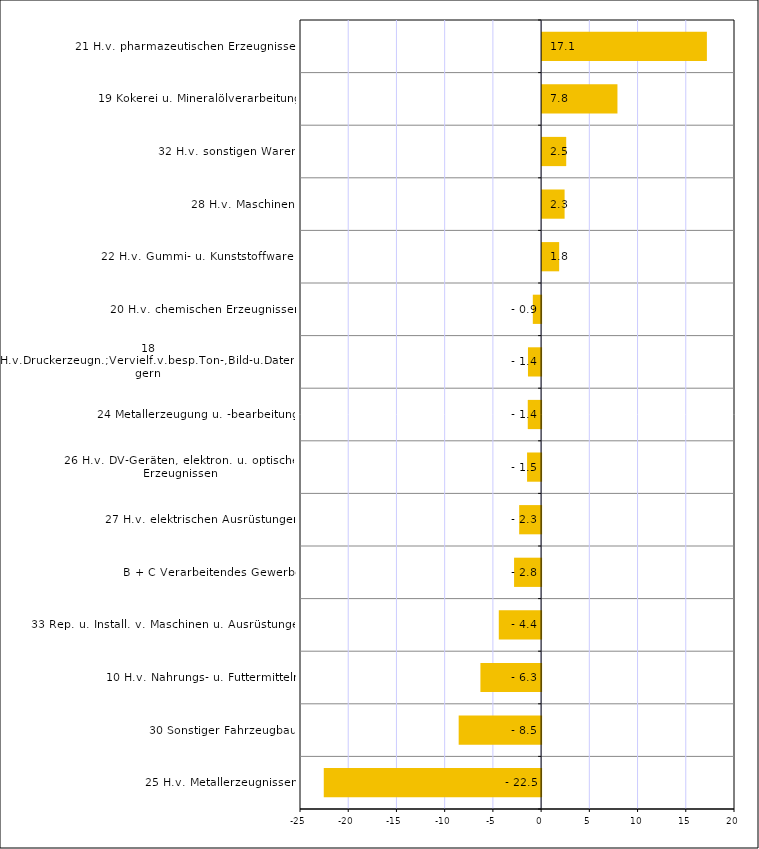
| Category | Series 0 |
|---|---|
| 25 H.v. Metallerzeugnissen | -22.535 |
| 30 Sonstiger Fahrzeugbau | -8.548 |
| 10 H.v. Nahrungs- u. Futtermitteln | -6.292 |
| 33 Rep. u. Install. v. Maschinen u. Ausrüstungen | -4.388 |
| B + C Verarbeitendes Gewerbe | -2.804 |
| 27 H.v. elektrischen Ausrüstungen | -2.275 |
| 26 H.v. DV-Geräten, elektron. u. optischen Erzeugnissen | -1.456 |
| 24 Metallerzeugung u. -bearbeitung | -1.383 |
| 18 H.v.Druckerzeugn.;Vervielf.v.besp.Ton-,Bild-u.Datenträgern | -1.363 |
| 20 H.v. chemischen Erzeugnissen | -0.86 |
| 22 H.v. Gummi- u. Kunststoffwaren | 1.767 |
| 28 H.v. Maschinen | 2.331 |
| 32 H.v. sonstigen Waren | 2.5 |
| 19 Kokerei u. Mineralölverarbeitung | 7.812 |
| 21 H.v. pharmazeutischen Erzeugnissen | 17.086 |